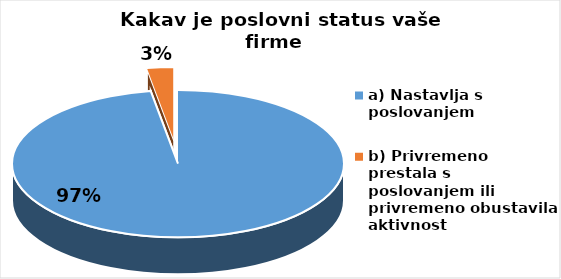
| Category | Series 0 |
|---|---|
| a) Nastavlja s poslovanjem | 333 |
| b) Privremeno prestala s poslovanjem ili privremeno obustavila aktivnost | 9 |
| c) Trajno prestala s poslovanjem | 0 |